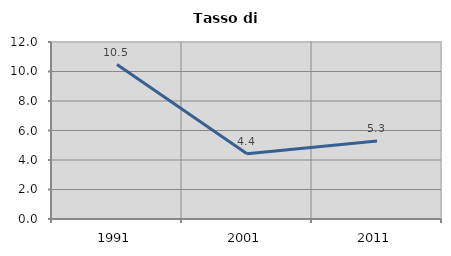
| Category | Tasso di disoccupazione   |
|---|---|
| 1991.0 | 10.467 |
| 2001.0 | 4.43 |
| 2011.0 | 5.285 |